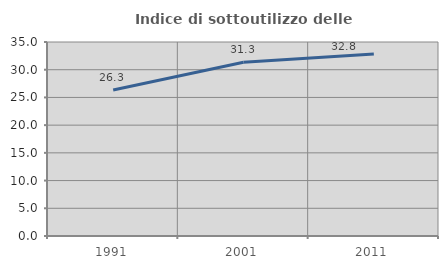
| Category | Indice di sottoutilizzo delle abitazioni  |
|---|---|
| 1991.0 | 26.346 |
| 2001.0 | 31.342 |
| 2011.0 | 32.842 |